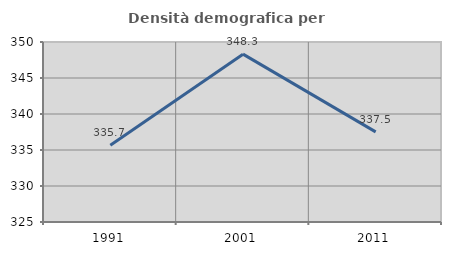
| Category | Densità demografica |
|---|---|
| 1991.0 | 335.674 |
| 2001.0 | 348.31 |
| 2011.0 | 337.517 |